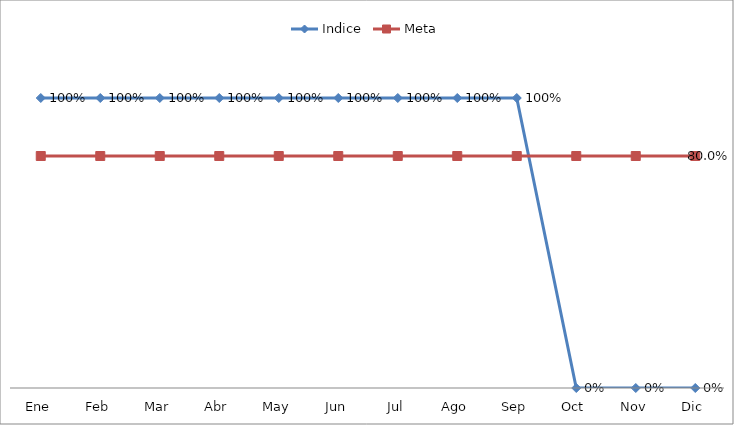
| Category | Indice | Meta |
|---|---|---|
| Ene | 1 | 0.8 |
| Feb | 1 | 0.8 |
| Mar | 1 | 0.8 |
| Abr | 1 | 0.8 |
| May | 1 | 0.8 |
| Jun | 1 | 0.8 |
| Jul | 1 | 0.8 |
| Ago | 1 | 0.8 |
| Sep | 1 | 0.8 |
| Oct | 0 | 0.8 |
| Nov | 0 | 0.8 |
| Dic | 0 | 0.8 |